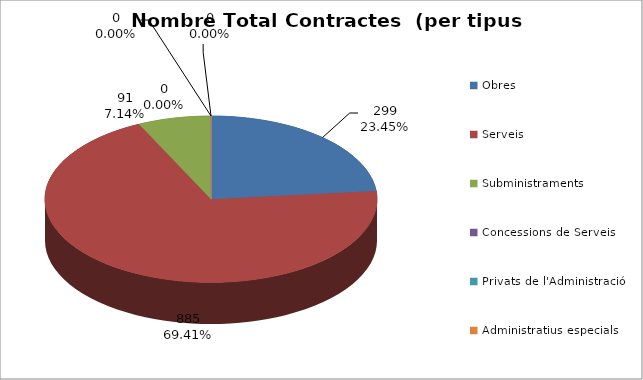
| Category | Nombre Total Contractes |
|---|---|
| Obres | 299 |
| Serveis | 885 |
| Subministraments | 91 |
| Concessions de Serveis | 0 |
| Privats de l'Administració | 0 |
| Administratius especials | 0 |